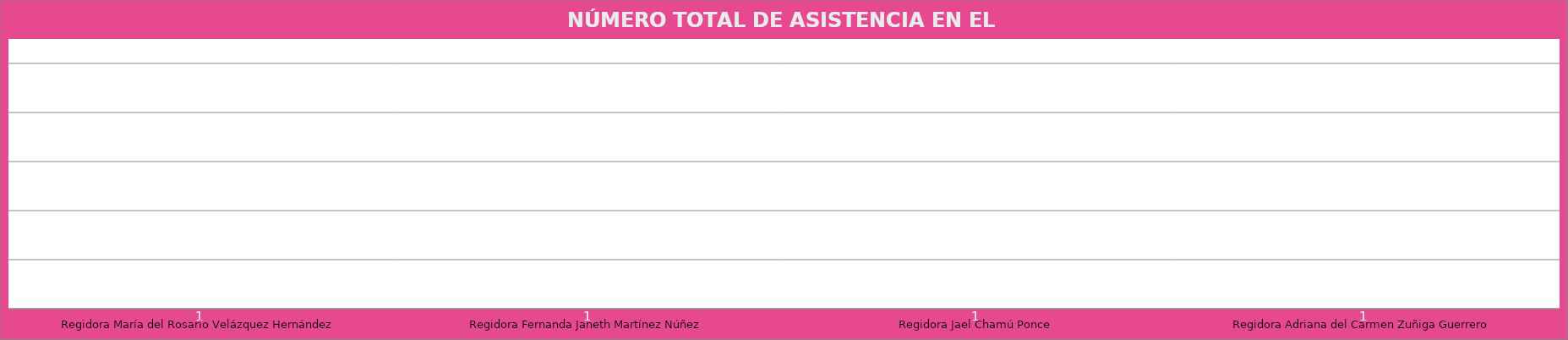
| Category | Regidora María del Rosario Velázquez Hernández |
|---|---|
| Regidora María del Rosario Velázquez Hernández | 1 |
| Regidora Fernanda Janeth Martínez Núñez | 1 |
| Regidora Jael Chamú Ponce | 1 |
| Regidora Adriana del Carmen Zuñiga Guerrero | 1 |